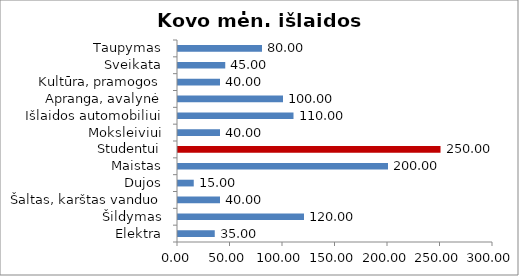
| Category | Kovo mėn. išlaidos |
|---|---|
| Elektra | 35 |
| Šildymas | 120 |
| Šaltas, karštas vanduo | 40 |
| Dujos | 15 |
| Maistas | 200 |
| Studentui | 250 |
| Moksleiviui | 40 |
| Išlaidos automobiliui | 110 |
| Apranga, avalynė | 100 |
| Kultūra, pramogos | 40 |
| Sveikata | 45 |
| Taupymas | 80 |